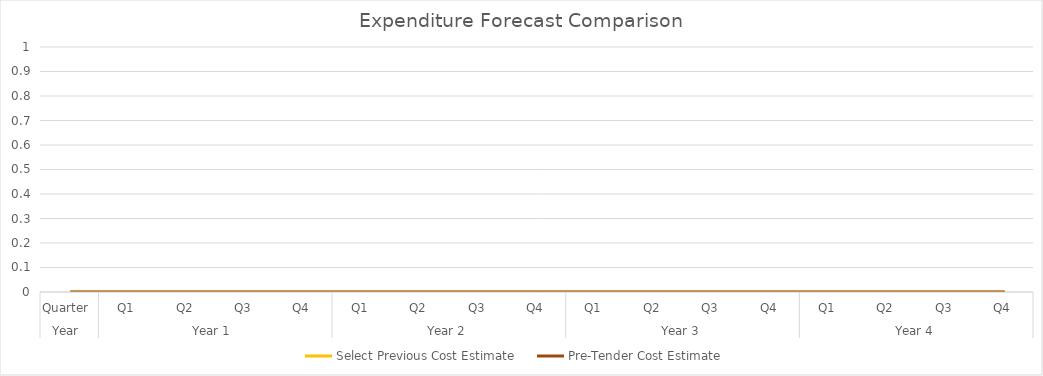
| Category | Select Previous Cost Estimate | Pre-Tender Cost Estimate |
|---|---|---|
| 0 | 0 | 0 |
| 1 | 0 | 0 |
| 2 | 0 | 0 |
| 3 | 0 | 0 |
| 4 | 0 | 0 |
| 5 | 0 | 0 |
| 6 | 0 | 0 |
| 7 | 0 | 0 |
| 8 | 0 | 0 |
| 9 | 0 | 0 |
| 10 | 0 | 0 |
| 11 | 0 | 0 |
| 12 | 0 | 0 |
| 13 | 0 | 0 |
| 14 | 0 | 0 |
| 15 | 0 | 0 |
| 16 | 0 | 0 |